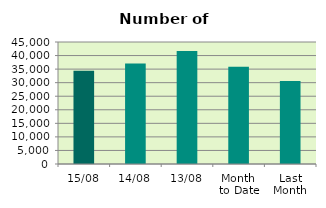
| Category | Series 0 |
|---|---|
| 15/08 | 34404 |
| 14/08 | 37064 |
| 13/08 | 41666 |
| Month 
to Date | 35875.273 |
| Last
Month | 30613.13 |